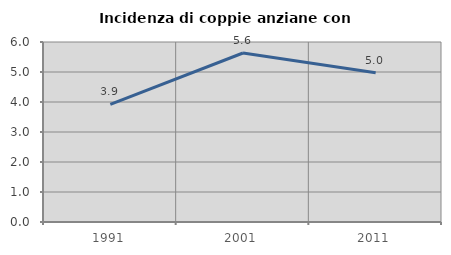
| Category | Incidenza di coppie anziane con figli |
|---|---|
| 1991.0 | 3.922 |
| 2001.0 | 5.634 |
| 2011.0 | 4.975 |